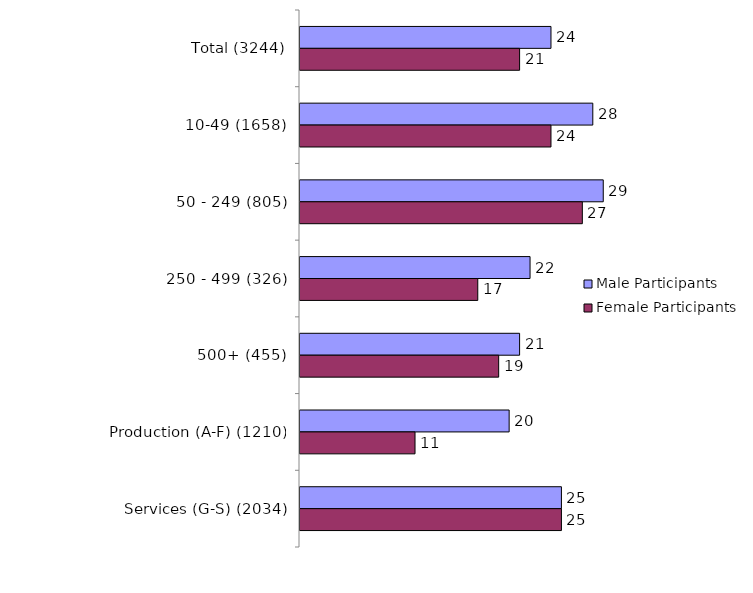
| Category | Male Participants | Female Participants |
|---|---|---|
| Total (3244) | 24 | 21 |
| 10-49 (1658) | 28 | 24 |
| 50 - 249 (805) | 29 | 27 |
| 250 - 499 (326) | 22 | 17 |
| 500+ (455) | 21 | 19 |
| Production (A-F) (1210) | 20 | 11 |
| Services (G-S) (2034) | 25 | 25 |